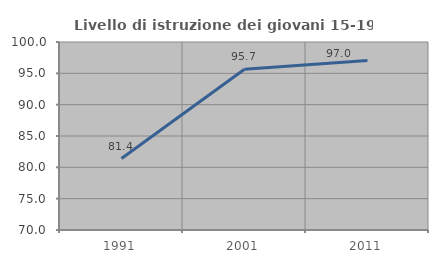
| Category | Livello di istruzione dei giovani 15-19 anni |
|---|---|
| 1991.0 | 81.408 |
| 2001.0 | 95.652 |
| 2011.0 | 97.041 |